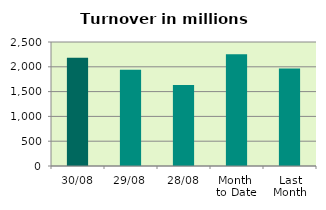
| Category | Series 0 |
|---|---|
| 30/08 | 2181.474 |
| 29/08 | 1941.279 |
| 28/08 | 1633.204 |
| Month 
to Date | 2251.437 |
| Last
Month | 1965.856 |